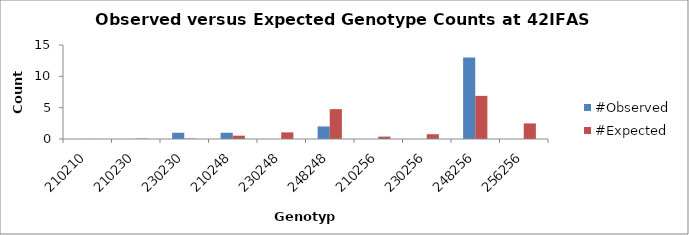
| Category | #Observed | #Expected |
|---|---|---|
| 210210.0 | 0 | 0.015 |
| 210230.0 | 0 | 0.059 |
| 230230.0 | 1 | 0.059 |
| 210248.0 | 1 | 0.529 |
| 230248.0 | 0 | 1.059 |
| 248248.0 | 2 | 4.765 |
| 210256.0 | 0 | 0.382 |
| 230256.0 | 0 | 0.765 |
| 248256.0 | 13 | 6.882 |
| 256256.0 | 0 | 2.485 |